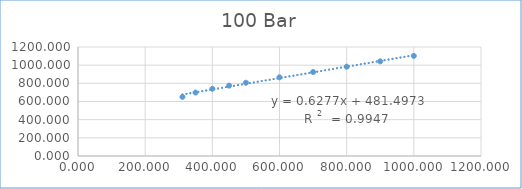
| Category | Series 0 |
|---|---|
| 311.0 | 651.099 |
| 350.0 | 698.519 |
| 400.0 | 739.943 |
| 450.0 | 774.558 |
| 500.0 | 806.283 |
| 600.0 | 866.173 |
| 700.0 | 924.51 |
| 800.0 | 982.919 |
| 900.0 | 1042.045 |
| 1000.0 | 1102.198 |